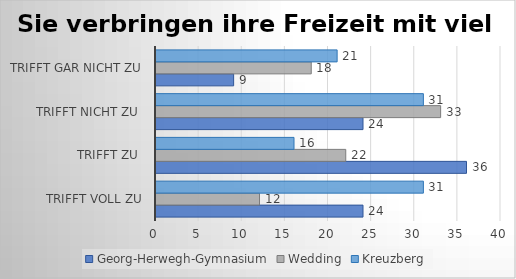
| Category | Georg-Herwegh-Gymnasium | Wedding | Kreuzberg |
|---|---|---|---|
| trifft voll zu | 24 | 12 | 31 |
| trifft zu  | 36 | 22 | 16 |
| trifft nicht zu  | 24 | 33 | 31 |
| trifft gar nicht zu | 9 | 18 | 21 |